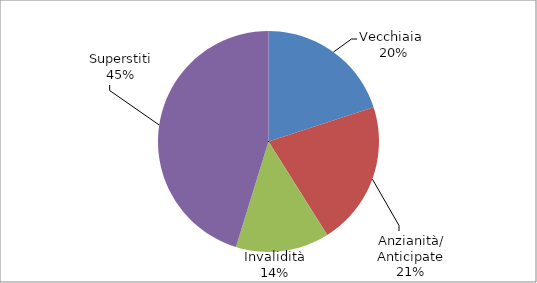
| Category | Series 0 |
|---|---|
| Vecchiaia  | 2186 |
| Anzianità/ Anticipate | 2306 |
| Invalidità | 1497 |
| Superstiti | 4947 |